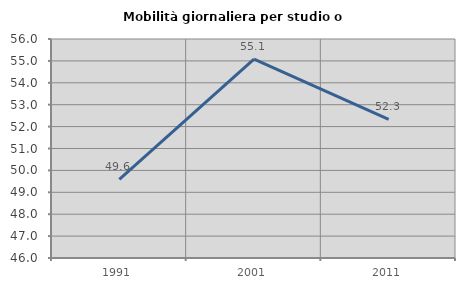
| Category | Mobilità giornaliera per studio o lavoro |
|---|---|
| 1991.0 | 49.586 |
| 2001.0 | 55.076 |
| 2011.0 | 52.333 |